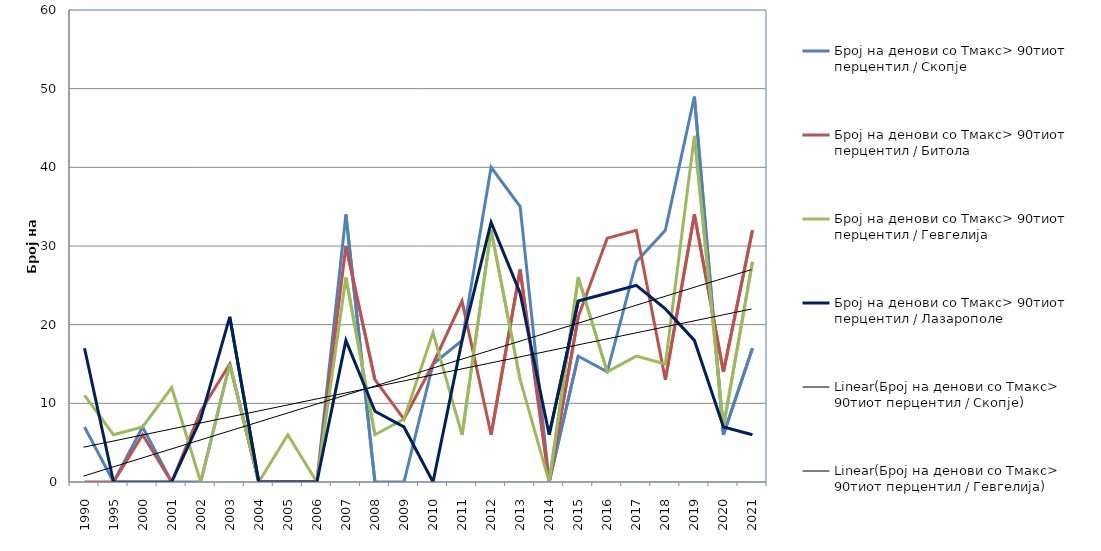
| Category | Број на денови со Тмакс> 90тиот перцентил / Скопје | Број на денови со Тмакс> 90тиот перцентил / Битола | Број на денови со Тмакс> 90тиот перцентил / Гевгелија | Број на денови со Тмакс> 90тиот перцентил / Лазарополе |
|---|---|---|---|---|
| 1990.0 | 7 | 0 | 11 | 17 |
| 1995.0 | 0 | 0 | 6 | 0 |
| 2000.0 | 7 | 6 | 7 | 0 |
| 2001.0 | 0 | 0 | 12 | 0 |
| 2002.0 | 0 | 9 | 0 | 8 |
| 2003.0 | 15 | 15 | 15 | 21 |
| 2004.0 | 0 | 0 | 0 | 0 |
| 2005.0 | 0 | 0 | 6 | 0 |
| 2006.0 | 0 | 0 | 0 | 0 |
| 2007.0 | 34 | 30 | 26 | 18 |
| 2008.0 | 0 | 13 | 6 | 9 |
| 2009.0 | 0 | 8 | 8 | 7 |
| 2010.0 | 15 | 15 | 19 | 0 |
| 2011.0 | 18 | 23 | 6 | 18 |
| 2012.0 | 40 | 6 | 32 | 33 |
| 2013.0 | 35 | 27 | 13 | 24 |
| 2014.0 | 0 | 0 | 0 | 6 |
| 2015.0 | 16 | 21 | 26 | 23 |
| 2016.0 | 14 | 31 | 14 | 24 |
| 2017.0 | 28 | 32 | 16 | 25 |
| 2018.0 | 32 | 13 | 15 | 22 |
| 2019.0 | 49 | 34 | 44 | 18 |
| 2020.0 | 6 | 14 | 7 | 7 |
| 2021.0 | 17 | 32 | 28 | 6 |